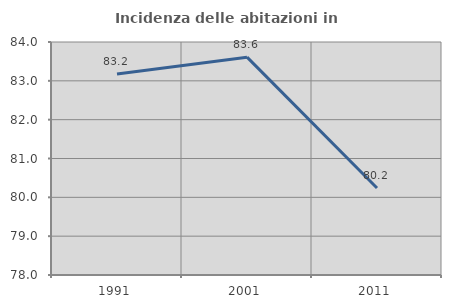
| Category | Incidenza delle abitazioni in proprietà  |
|---|---|
| 1991.0 | 83.175 |
| 2001.0 | 83.61 |
| 2011.0 | 80.241 |